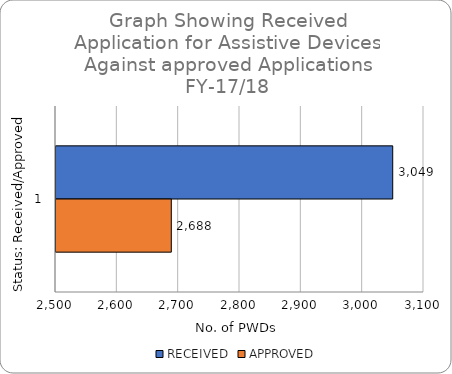
| Category | RECEIVED | APPROVED |
|---|---|---|
| 0 | 3049 | 2688 |